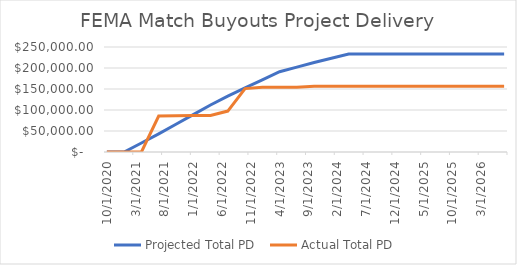
| Category | Projected Total PD  | Actual Total PD  |
|---|---|---|
| 10/1/20 | 0 | 0 |
| 1/1/21 | 0 | 0 |
| 4/1/21 | 21449.359 | 0 |
| 7/1/21 | 43273.718 | 85500 |
| 10/1/21 | 66014.744 | 86250 |
| 1/1/22 | 89005.769 | 87000 |
| 4/1/22 | 111996.795 | 87000 |
| 7/1/22 | 133187.821 | 97500 |
| 10/1/22 | 152503.846 | 151013 |
| 1/1/23 | 171819.872 | 154013 |
| 4/1/23 | 191135.897 | 154013 |
| 7/1/23 | 202160.256 | 154013 |
| 10/1/23 | 213184.615 | 156263 |
| 1/1/24 | 223292.308 | 156263 |
| 4/1/24 | 233150 | 156263 |
| 7/1/24 | 233150 | 156263 |
| 10/1/24 | 233150 | 156263 |
| 1/1/25 | 233150 | 156263 |
| 4/1/25 | 233150 | 156263 |
| 7/1/25 | 233150 | 156263 |
| 10/1/25 | 233150 | 156263 |
| 1/1/26 | 233150 | 156263 |
| 4/1/26 | 233150 | 156263 |
| 7/1/26 | 233150 | 156263 |